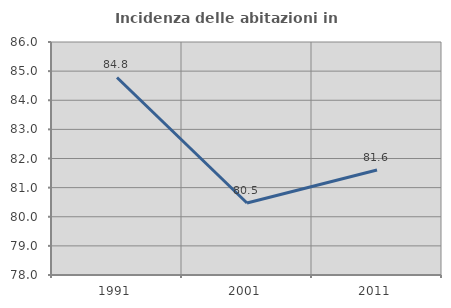
| Category | Incidenza delle abitazioni in proprietà  |
|---|---|
| 1991.0 | 84.783 |
| 2001.0 | 80.473 |
| 2011.0 | 81.607 |